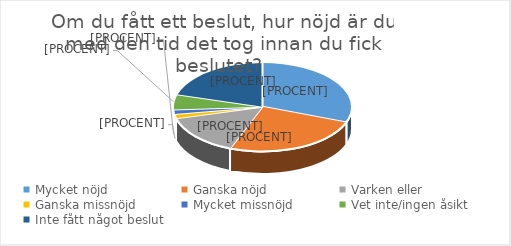
| Category | Series 0 |
|---|---|
| Mycket nöjd  | 39 |
| Ganska nöjd | 32 |
| Varken eller  | 19 |
| Ganska missnöjd | 2 |
| Mycket missnöjd  | 2 |
| Vet inte/ingen åsikt | 7 |
| Inte fått något beslut | 26 |